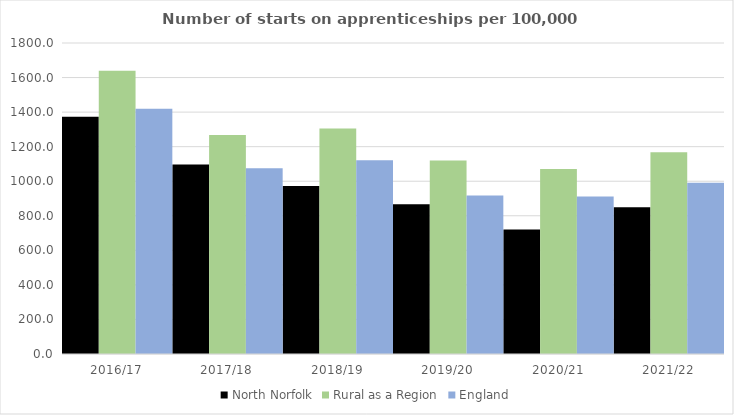
| Category | North Norfolk | Rural as a Region | England |
|---|---|---|---|
| 2016/17 | 1373 | 1638.789 | 1420 |
| 2017/18 | 1097 | 1267.474 | 1075 |
| 2018/19 | 973 | 1304.57 | 1122 |
| 2019/20 | 866 | 1119.662 | 918 |
| 2020/21 | 720 | 1070.748 | 912 |
| 2021/22 | 849 | 1167.68 | 991 |